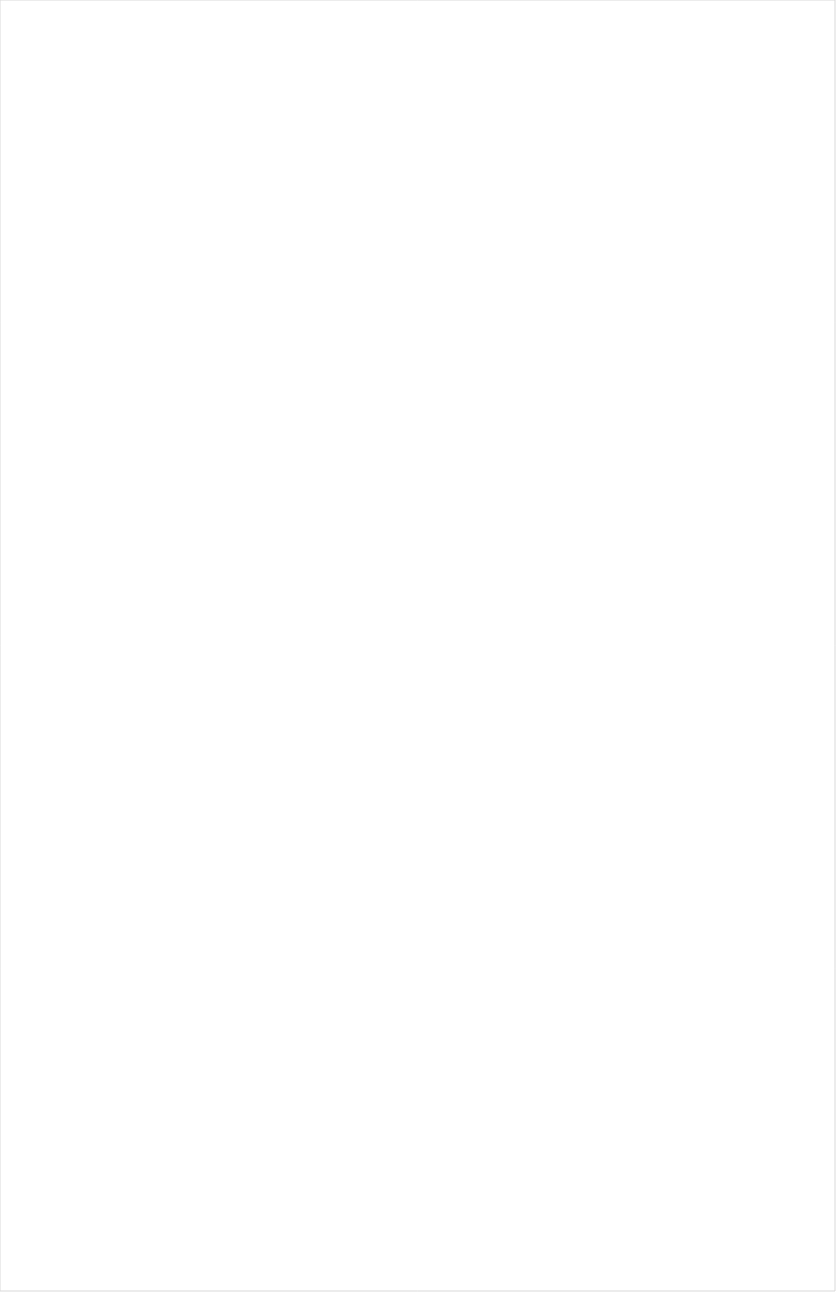
| Category | Total |
|---|---|
| Cartoon Network | -0.593 |
| TUDN | -0.229 |
| Teen Nick | -0.208 |
| Nick Jr. | -0.203 |
| Nick Toons | -0.195 |
| Disney Channel | -0.194 |
| Disney Junior US | -0.192 |
| Nick | -0.19 |
| UniMas | -0.183 |
| VH1 | -0.181 |
| Univision | -0.178 |
| MTV | -0.171 |
| NBC Universo | -0.17 |
| Disney XD | -0.169 |
| MTV2 | -0.169 |
| Galavision | -0.166 |
| Telemundo | -0.161 |
| Adult Swim | -0.157 |
| Nick@Nite | -0.152 |
| Universal Kids | -0.151 |
| Comedy Central | -0.146 |
| truTV | -0.141 |
| BET | -0.14 |
| Freeform | -0.126 |
| MyNetworkTV | -0.125 |
| TV ONE | -0.124 |
| ESPN2 | -0.096 |
| ESPN Deportes | -0.096 |
| NBA TV | -0.095 |
| Viceland | -0.092 |
| ESPN | -0.09 |
| ESPNEWS | -0.087 |
| BET Her | -0.086 |
| FXX | -0.08 |
| MLB Network | -0.073 |
| FX | -0.071 |
| TNT | -0.063 |
| E! | -0.063 |
| SYFY | -0.053 |
| BRAVO | -0.052 |
| A&E | -0.047 |
| TBS | -0.047 |
| NFL Network | -0.045 |
| WE TV | -0.045 |
| Discovery Family Channel | -0.044 |
| USA Network | -0.044 |
| Paramount Network | -0.044 |
| Lifetime | -0.04 |
| TLC | -0.035 |
| AMC | -0.033 |
| Logo | -0.032 |
| FX Movie Channel | -0.03 |
| Lifetime Movies | -0.027 |
| Independent Film (IFC) | -0.024 |
| The Sportsman Channel | -0.016 |
| Food Network | -0.013 |
| FOX | -0.009 |
| Oprah Winfrey Network | -0.007 |
| NHL | -0.004 |
| Cooking Channel | -0.003 |
| Destination America | -0.001 |
| NBC Sports | 0 |
| Discovery Channel | 0.001 |
| Investigation Discovery | 0.001 |
| Travel | 0.003 |
| Big Ten Network | 0.004 |
| ESPNU | 0.007 |
| CNBC | 0.009 |
| FXDEP | 0.014 |
| CW | 0.017 |
| CMTV | 0.022 |
| CNN | 0.024 |
| Ovation | 0.026 |
| FYI | 0.034 |
| Fox Sports 1 | 0.036 |
| Discovery Life Channel | 0.037 |
| Reelz Channel | 0.038 |
| POP | 0.039 |
| Animal Planet | 0.041 |
| Motor Trend Network | 0.041 |
| Headline News | 0.043 |
| National Geographic | 0.045 |
| BBC America | 0.046 |
| OXYGEN | 0.05 |
| ION | 0.058 |
| CBS Sports | 0.061 |
| Game Show | 0.061 |
| DIY | 0.063 |
| ABC | 0.063 |
| UP TV | 0.064 |
| HGTV | 0.065 |
| American Heroes Channel | 0.067 |
| NBC | 0.07 |
| FOX Sports 2 | 0.073 |
| National Geographic Wild | 0.074 |
| History Channel | 0.075 |
| Golf | 0.076 |
| Olympic Channel | 0.078 |
| WGN America | 0.085 |
| SundanceTV | 0.085 |
| TV LAND | 0.086 |
| Science Channel | 0.089 |
| Outdoor Channel | 0.095 |
| Weather Channel | 0.108 |
| Great American Country | 0.112 |
| Fox News | 0.114 |
| CBS | 0.132 |
| Bloomberg HD | 0.139 |
| PAC-12 Network | 0.143 |
| Hallmark | 0.149 |
| MSNBC | 0.152 |
| Smithsonian | 0.18 |
| Tennis Channel | 0.204 |
| Fox Business | 0.213 |
| INSP | 0.241 |
| Hallmark Movies & Mysteries | 0.249 |
| RFD TV | 0.285 |
| PBS | 0.328 |